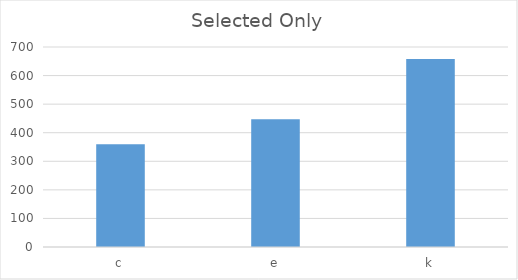
| Category | ChartSeries |
|---|---|
| c | 359.85 |
| e | 446.86 |
| k | 658.24 |